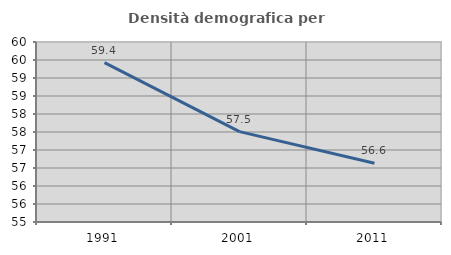
| Category | Densità demografica |
|---|---|
| 1991.0 | 59.426 |
| 2001.0 | 57.511 |
| 2011.0 | 56.634 |